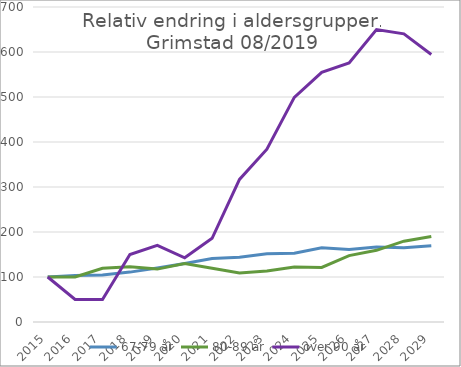
| Category | 67-79 år | 80-89 år | over 90 år |
|---|---|---|---|
| 2015.0 | 100 | 100 | 100 |
| 2016.0 | 103.261 | 100 | 50 |
| 2017.0 | 104.348 | 119.355 | 50 |
| 2018.0 | 110.87 | 122.581 | 150 |
| 2019.0 | 120.191 | 117.529 | 170.447 |
| 2020.0 | 130.231 | 129.685 | 142.604 |
| 2021.0 | 140.965 | 119.239 | 185.986 |
| 2022.0 | 144 | 108.99 | 316.771 |
| 2023.0 | 151.502 | 113.512 | 384.003 |
| 2024.0 | 152.949 | 122.121 | 499.124 |
| 2025.0 | 165.093 | 121.329 | 554.912 |
| 2026.0 | 161.315 | 147.484 | 575.552 |
| 2027.0 | 166.595 | 159.315 | 649.774 |
| 2028.0 | 165.225 | 179.567 | 640.329 |
| 2029.0 | 169.533 | 190.161 | 594.504 |